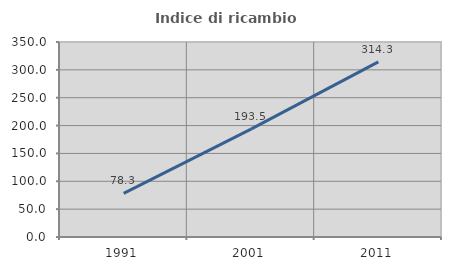
| Category | Indice di ricambio occupazionale  |
|---|---|
| 1991.0 | 78.333 |
| 2001.0 | 193.548 |
| 2011.0 | 314.286 |